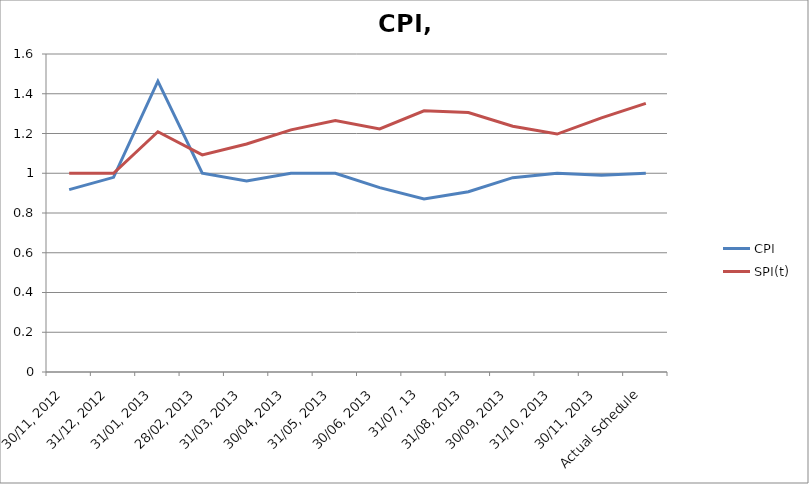
| Category | CPI | SPI(t) |
|---|---|---|
| 30/11, 2012 | 0.917 | 1 |
| 31/12, 2012 | 0.979 | 1 |
| 31/01, 2013 | 1.463 | 1.209 |
| 28/02, 2013 | 1 | 1.092 |
| 31/03, 2013 | 0.961 | 1.147 |
| 30/04, 2013 | 1 | 1.218 |
| 31/05, 2013 | 1 | 1.265 |
| 30/06, 2013 | 0.928 | 1.223 |
| 31/07, 13 | 0.871 | 1.315 |
| 31/08, 2013 | 0.907 | 1.306 |
| 30/09, 2013 | 0.978 | 1.237 |
| 31/10, 2013 | 1 | 1.197 |
| 30/11, 2013 | 0.989 | 1.278 |
| Actual Schedule | 1 | 1.352 |